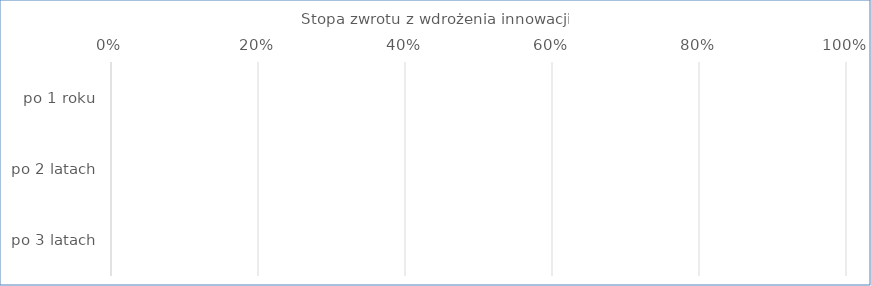
| Category | Stopa zwrotu z wdrożenia innowacji |
|---|---|
| po 1 roku | 0 |
| po 2 latach | 0 |
| po 3 latach | 0 |